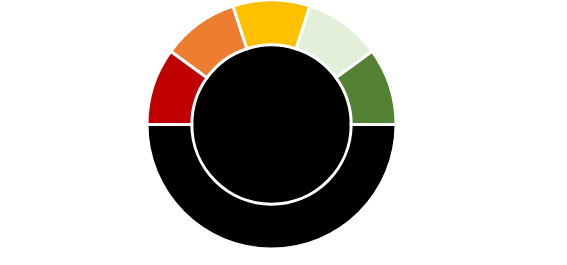
| Category | puntero |
|---|---|
| 0 | 0 |
| 1 | 3 |
| 2 | 0 |